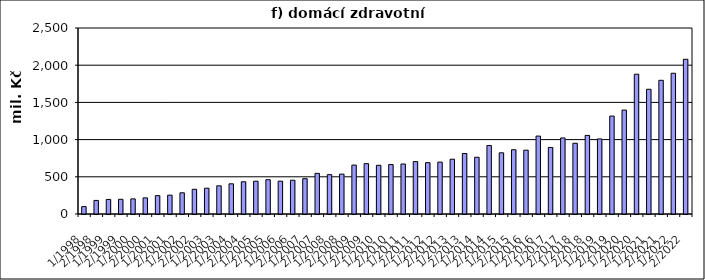
| Category | Series 0 |
|---|---|
| 1/1998 | 99503.525 |
| 2/1998 | 182478.574 |
| 1/1999 | 195637.487 |
| 2/1999 | 197784.513 |
| 1/2000 | 203130.806 |
| 2/2000 | 216595.714 |
| 1/2001 | 246770.432 |
| 2/2001 | 253465.034 |
| 1/2002 | 284952 |
| 2/2002 | 332450 |
| 1/2003 | 346564 |
| 2/2003 | 378803.651 |
| 1/2004 | 405611.977 |
| 2/2004 | 433177.909 |
| 1/2005 | 440657 |
| 2/2005 | 460948.86 |
| 1/2006 | 441353 |
| 2/2006 | 454133 |
| 1/2007 | 474776 |
| 2/2007 | 546385 |
| 1/2008 | 529021.704 |
| 2/2008 | 535716.296 |
| 1/2009 | 657761 |
| 2/2009 | 676757 |
| 1/2010 | 654495 |
| 2/2010 | 664470 |
| 1/2011 | 671830 |
| 2/2011 | 704189 |
| 1/2012 | 690049 |
| 2/2012 | 697526 |
| 1/2013 | 736355 |
| 2/2013 | 812775 |
| 1/2014 | 762751 |
| 2/2014 | 921108 |
| 1/2015 | 822410 |
| 2/2015 | 863655 |
| 1/2016 | 857778 |
| 2/2016 | 1047131 |
| 1/2017 | 894514 |
| 2/2017 | 1022106 |
| 1/2018 | 950601.065 |
| 2/2018 | 1056146.177 |
| 1/2019 | 1008983.8 |
| 2/2019 | 1316357.912 |
| 1/2020 | 1396590.99 |
| 2/2020 | 1878640.01 |
| 1/2021 | 1676279.134 |
| 2/2021 | 1797049.91 |
| 1/2022 | 1891723.83 |
| 2/2022 | 2079362.272 |